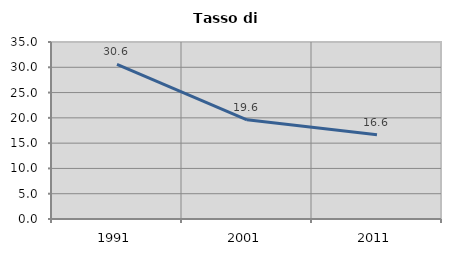
| Category | Tasso di disoccupazione   |
|---|---|
| 1991.0 | 30.595 |
| 2001.0 | 19.615 |
| 2011.0 | 16.646 |